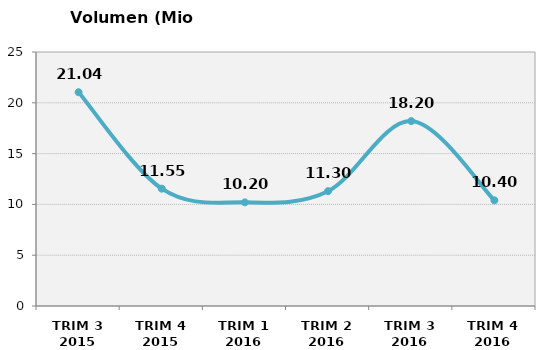
| Category | Volumen (Mio consumiciones) |
|---|---|
| TRIM 3 2015 | 21.039 |
| TRIM 4 2015 | 11.549 |
| TRIM 1 2016 | 10.2 |
| TRIM 2 2016 | 11.3 |
| TRIM 3 2016 | 18.2 |
| TRIM 4 2016 | 10.4 |